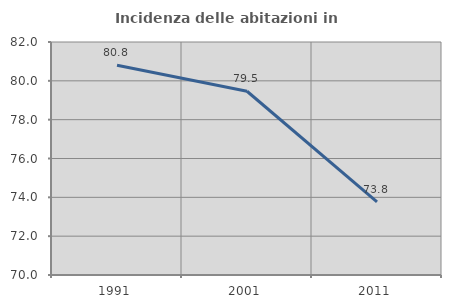
| Category | Incidenza delle abitazioni in proprietà  |
|---|---|
| 1991.0 | 80.802 |
| 2001.0 | 79.463 |
| 2011.0 | 73.767 |